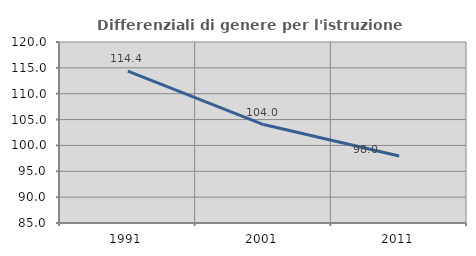
| Category | Differenziali di genere per l'istruzione superiore |
|---|---|
| 1991.0 | 114.36 |
| 2001.0 | 104.037 |
| 2011.0 | 97.953 |